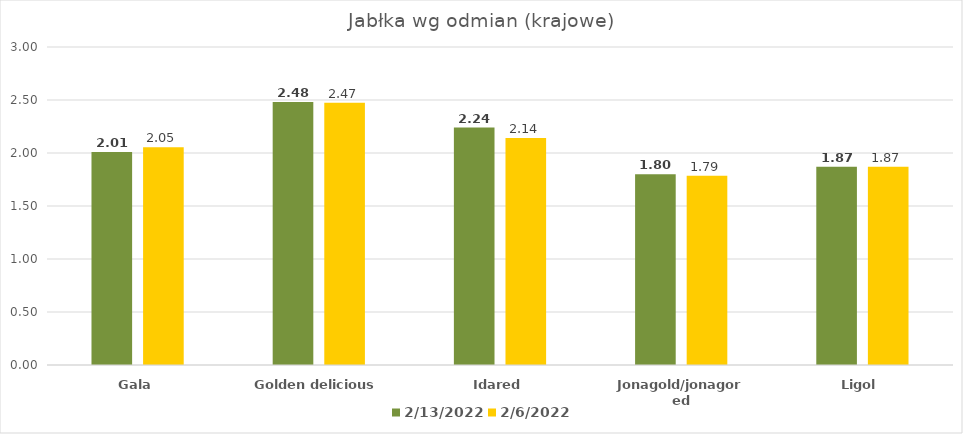
| Category | 13.02.2022 | 06.02.2022 |
|---|---|---|
| Gala | 2.01 | 2.055 |
| Golden delicious | 2.48 | 2.475 |
| Idared | 2.24 | 2.142 |
| Jonagold/jonagored | 1.8 | 1.786 |
| Ligol | 1.87 | 1.87 |